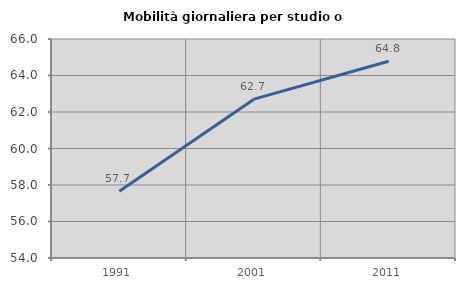
| Category | Mobilità giornaliera per studio o lavoro |
|---|---|
| 1991.0 | 57.653 |
| 2001.0 | 62.703 |
| 2011.0 | 64.778 |